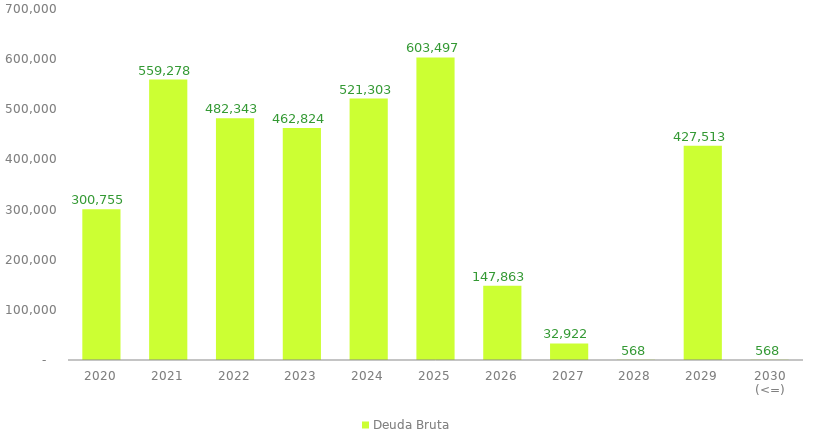
| Category | Deuda Bruta |
|---|---|
| 2020 | 300755.243 |
| 2021 | 559278.333 |
| 2022 | 482343.278 |
| 2023 | 462823.749 |
| 2024 | 521302.917 |
| 2025 | 603497.4 |
| 2026 | 147862.771 |
| 2027 | 32922.49 |
| 2028 | 567.533 |
| 2029 | 427512.903 |
| 2030 (<=) | 567.533 |